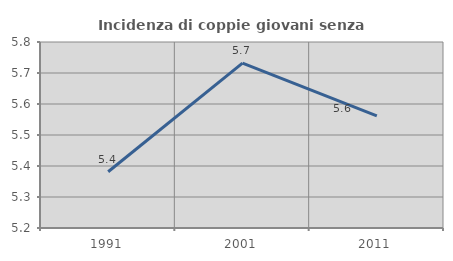
| Category | Incidenza di coppie giovani senza figli |
|---|---|
| 1991.0 | 5.381 |
| 2001.0 | 5.732 |
| 2011.0 | 5.561 |